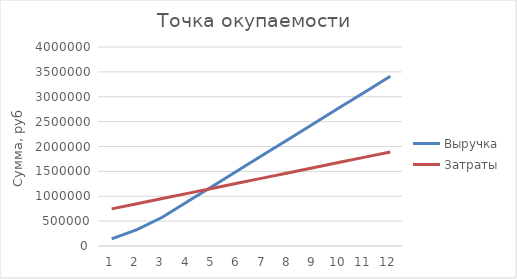
| Category | Выручка | Затраты |
|---|---|---|
| 0 | 144800 | 746431.667 |
| 1 | 330868 | 850026.733 |
| 2 | 577752 | 953662.6 |
| 3 | 892692 | 1057701.267 |
| 4 | 1207632 | 1161739.933 |
| 5 | 1522572 | 1265778.6 |
| 6 | 1837512 | 1369817.267 |
| 7 | 2152452 | 1473855.933 |
| 8 | 2467392 | 1577894.6 |
| 9 | 2782332 | 1681933.267 |
| 10 | 3097272 | 1785971.933 |
| 11 | 3412212 | 1890010.6 |